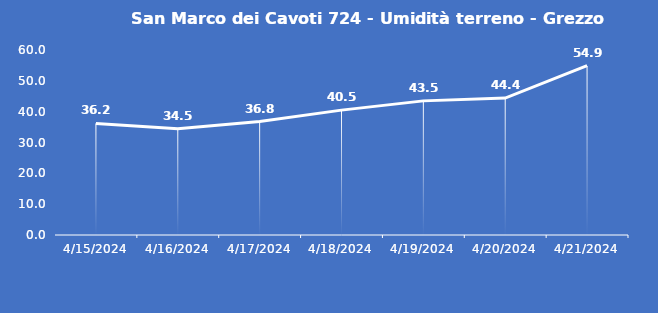
| Category | San Marco dei Cavoti 724 - Umidità terreno - Grezzo (%VWC) |
|---|---|
| 4/15/24 | 36.2 |
| 4/16/24 | 34.5 |
| 4/17/24 | 36.8 |
| 4/18/24 | 40.5 |
| 4/19/24 | 43.5 |
| 4/20/24 | 44.4 |
| 4/21/24 | 54.9 |